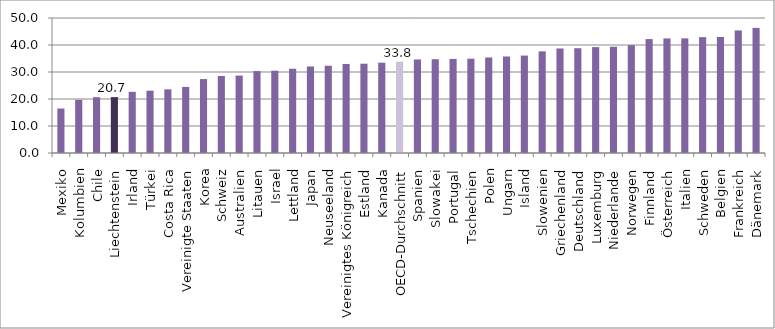
| Category | 2019 |
|---|---|
| Mexiko | 16.47 |
| Kolumbien | 19.68 |
| Chile | 20.66 |
| Liechtenstein | 20.7 |
| Irland | 22.66 |
| Türkei | 23.08 |
| Costa Rica | 23.58 |
| Vereinigte Staaten | 24.47 |
| Korea | 27.38 |
| Schweiz | 28.53 |
| Australien | 28.68 |
| Litauen | 30.34 |
| Israel | 30.47 |
| Lettland | 31.2 |
| Japan | 32.03 |
| Neuseeland | 32.31 |
| Vereinigtes Königreich | 32.98 |
| Estland | 33.07 |
| Kanada | 33.45 |
| OECD-Durchschnitt | 33.84 |
| Spanien | 34.65 |
| Slowakei | 34.74 |
| Portugal | 34.85 |
| Tschechien | 34.93 |
| Polen | 35.38 |
| Ungarn | 35.77 |
| Island | 36.08 |
| Slowenien | 37.65 |
| Griechenland | 38.71 |
| Deutschland | 38.81 |
| Luxemburg | 39.22 |
| Niederlande | 39.33 |
| Norwegen | 39.93 |
| Finnland | 42.19 |
| Österreich | 42.44 |
| Italien | 42.45 |
| Schweden | 42.91 |
| Belgien | 42.92 |
| Frankreich | 45.4 |
| Dänemark | 46.34 |